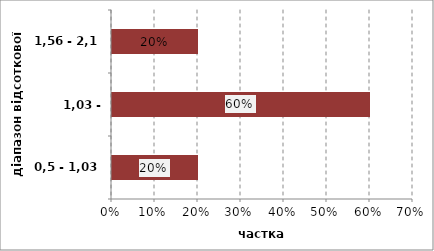
| Category | Series 0 |
|---|---|
| 0,5 - 1,03 | 0.2 |
| 1,03 - 1,56 | 0.6 |
| 1,56 - 2,1 | 0.2 |